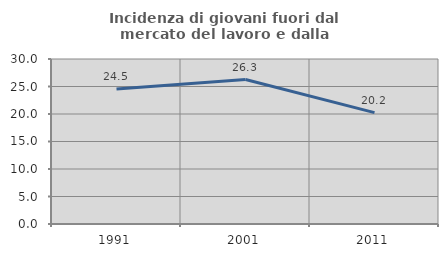
| Category | Incidenza di giovani fuori dal mercato del lavoro e dalla formazione  |
|---|---|
| 1991.0 | 24.525 |
| 2001.0 | 26.271 |
| 2011.0 | 20.246 |